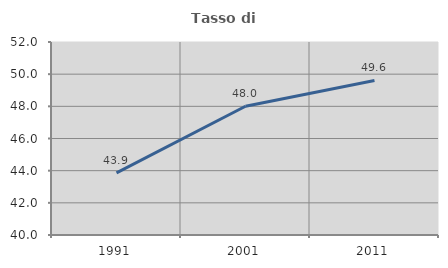
| Category | Tasso di occupazione   |
|---|---|
| 1991.0 | 43.862 |
| 2001.0 | 48.004 |
| 2011.0 | 49.608 |